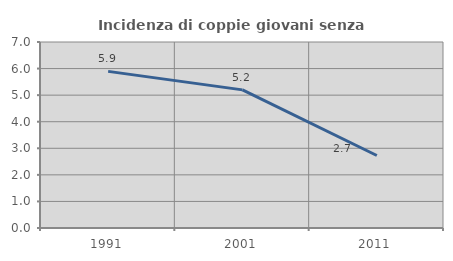
| Category | Incidenza di coppie giovani senza figli |
|---|---|
| 1991.0 | 5.894 |
| 2001.0 | 5.198 |
| 2011.0 | 2.729 |